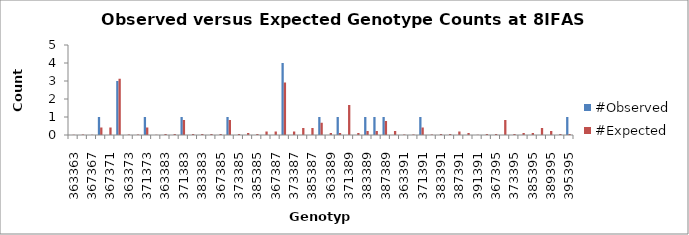
| Category | #Observed | #Expected |
|---|---|---|
| 363363.0 | 0 | 0.014 |
| 363367.0 | 0 | 0.028 |
| 367367.0 | 0 | 0.014 |
| 363371.0 | 1 | 0.417 |
| 367371.0 | 0 | 0.417 |
| 371371.0 | 3 | 3.125 |
| 363373.0 | 0 | 0.028 |
| 367373.0 | 0 | 0.028 |
| 371373.0 | 1 | 0.417 |
| 373373.0 | 0 | 0.014 |
| 363383.0 | 0 | 0.056 |
| 367383.0 | 0 | 0.056 |
| 371383.0 | 1 | 0.833 |
| 373383.0 | 0 | 0.056 |
| 383383.0 | 0 | 0.056 |
| 363385.0 | 0 | 0.056 |
| 367385.0 | 0 | 0.056 |
| 371385.0 | 1 | 0.833 |
| 373385.0 | 0 | 0.056 |
| 383385.0 | 0 | 0.111 |
| 385385.0 | 0 | 0.056 |
| 363387.0 | 0 | 0.194 |
| 367387.0 | 0 | 0.194 |
| 371387.0 | 4 | 2.917 |
| 373387.0 | 0 | 0.194 |
| 383387.0 | 0 | 0.389 |
| 385387.0 | 0 | 0.389 |
| 387387.0 | 1 | 0.681 |
| 363389.0 | 0 | 0.111 |
| 367389.0 | 1 | 0.111 |
| 371389.0 | 0 | 1.667 |
| 373389.0 | 0 | 0.111 |
| 383389.0 | 1 | 0.222 |
| 385389.0 | 1 | 0.222 |
| 387389.0 | 1 | 0.778 |
| 389389.0 | 0 | 0.222 |
| 363391.0 | 0 | 0.028 |
| 367391.0 | 0 | 0.028 |
| 371391.0 | 1 | 0.417 |
| 373391.0 | 0 | 0.028 |
| 383391.0 | 0 | 0.056 |
| 385391.0 | 0 | 0.056 |
| 387391.0 | 0 | 0.194 |
| 389391.0 | 0 | 0.111 |
| 391391.0 | 0 | 0.014 |
| 363395.0 | 0 | 0.056 |
| 367395.0 | 0 | 0.056 |
| 371395.0 | 0 | 0.833 |
| 373395.0 | 0 | 0.056 |
| 383395.0 | 0 | 0.111 |
| 385395.0 | 0 | 0.111 |
| 387395.0 | 0 | 0.389 |
| 389395.0 | 0 | 0.222 |
| 391395.0 | 0 | 0.056 |
| 395395.0 | 1 | 0.056 |